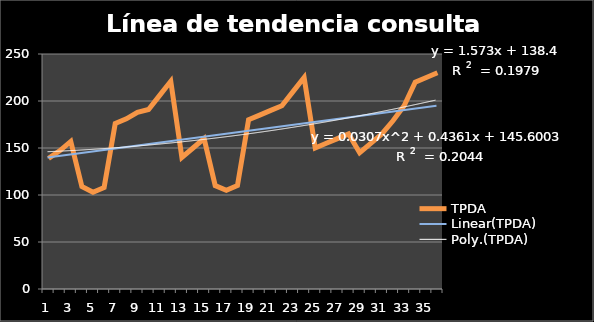
| Category | TPDA |
|---|---|
| 0 | 139 |
| 1 | 147 |
| 2 | 157 |
| 3 | 109 |
| 4 | 103 |
| 5 | 108 |
| 6 | 176 |
| 7 | 181 |
| 8 | 188 |
| 9 | 191 |
| 10 | 206 |
| 11 | 221 |
| 12 | 140 |
| 13 | 150 |
| 14 | 160 |
| 15 | 110 |
| 16 | 105 |
| 17 | 110 |
| 18 | 180 |
| 19 | 185 |
| 20 | 190 |
| 21 | 195 |
| 22 | 210 |
| 23 | 225 |
| 24 | 150 |
| 25 | 155 |
| 26 | 160 |
| 27 | 165 |
| 28 | 145 |
| 29 | 155 |
| 30 | 165 |
| 31 | 179 |
| 32 | 195 |
| 33 | 220 |
| 34 | 225 |
| 35 | 230 |